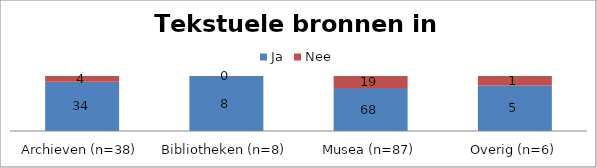
| Category | Ja | Nee |
|---|---|---|
| Archieven (n=38) | 34 | 4 |
| Bibliotheken (n=8) | 8 | 0 |
| Musea (n=87) | 68 | 19 |
| Overig (n=6) | 5 | 1 |